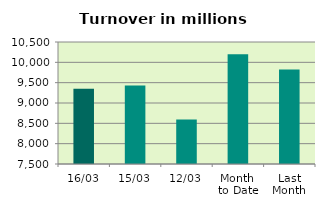
| Category | Series 0 |
|---|---|
| 16/03 | 9348.977 |
| 15/03 | 9432.899 |
| 12/03 | 8591.514 |
| Month 
to Date | 10201.328 |
| Last
Month | 9824.278 |